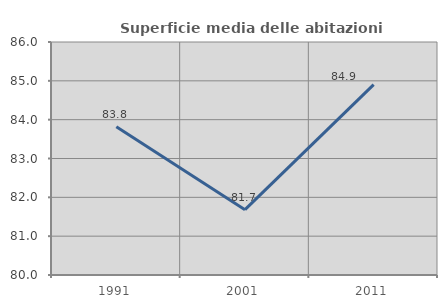
| Category | Superficie media delle abitazioni occupate |
|---|---|
| 1991.0 | 83.819 |
| 2001.0 | 81.682 |
| 2011.0 | 84.901 |